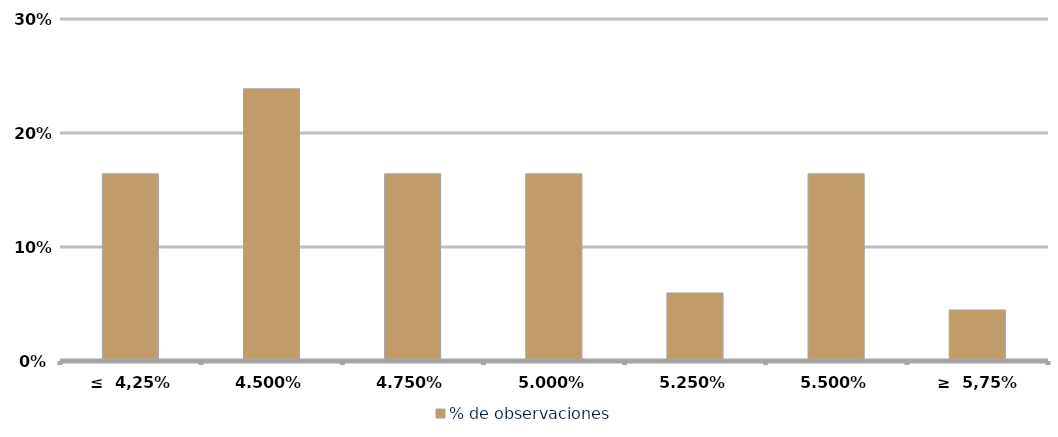
| Category | % de observaciones  |
|---|---|
| ≤  4,25% | 0.164 |
| 4,50% | 0.239 |
| 4,75% | 0.164 |
| 5,00% | 0.164 |
| 5,25% | 0.06 |
| 5,50% | 0.164 |
| ≥  5,75% | 0.045 |